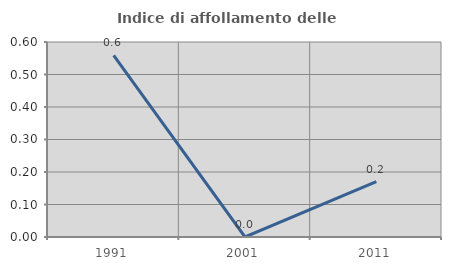
| Category | Indice di affollamento delle abitazioni  |
|---|---|
| 1991.0 | 0.559 |
| 2001.0 | 0 |
| 2011.0 | 0.171 |